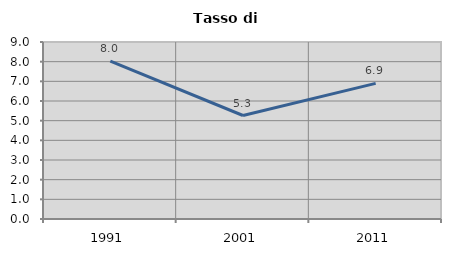
| Category | Tasso di disoccupazione   |
|---|---|
| 1991.0 | 8.028 |
| 2001.0 | 5.262 |
| 2011.0 | 6.897 |